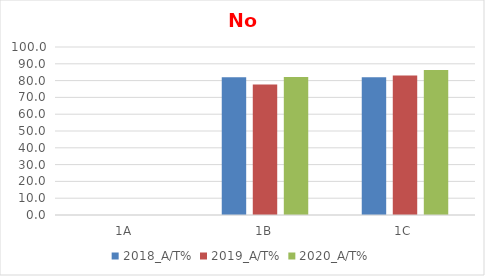
| Category | 2018_A/T% | 2019_A/T% | 2020_A/T% |
|---|---|---|---|
| 1A | 0 | 0 | 0 |
| 1B | 81.928 | 77.66 | 82.105 |
| 1C | 81.928 | 82.979 | 86.316 |